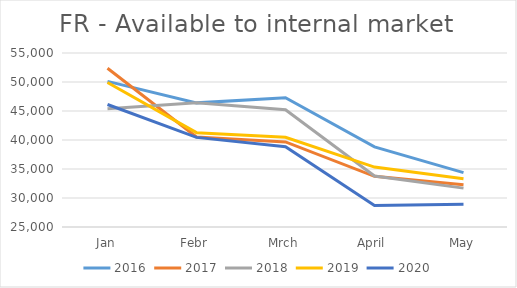
| Category | 2016 | 2017 | 2018 | 2019 | 2020 |
|---|---|---|---|---|---|
| Jan | 50101 | 52369.482 | 45390.159 | 49913.379 | 46123.48 |
| Febr | 46402 | 40523.681 | 46414.117 | 41263.973 | 40450.005 |
| Mrch | 47294 | 39660.507 | 45215.895 | 40465.138 | 38847.425 |
| April | 38817 | 33734.991 | 33800.242 | 35335.46 | 28711.58 |
| May | 34383 | 32294.99 | 31700.225 | 33301.108 | 28915.734 |